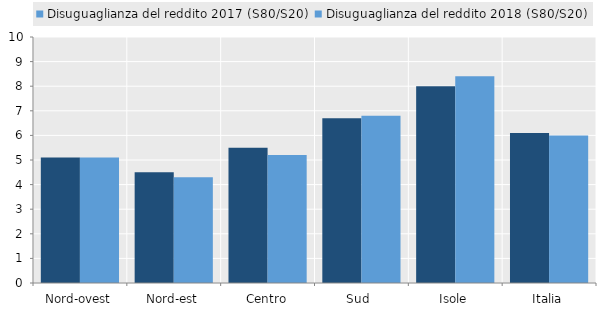
| Category | Disuguaglianza del reddito 2017 (S80/S20) | Disuguaglianza del reddito 2018 (S80/S20) |
|---|---|---|
| Nord-ovest | 5.1 | 5.1 |
| Nord-est | 4.5 | 4.3 |
| Centro | 5.5 | 5.2 |
| Sud  | 6.7 | 6.8 |
| Isole | 8 | 8.4 |
| Italia | 6.1 | 6 |